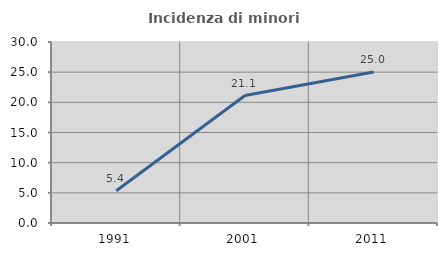
| Category | Incidenza di minori stranieri |
|---|---|
| 1991.0 | 5.357 |
| 2001.0 | 21.121 |
| 2011.0 | 25.036 |